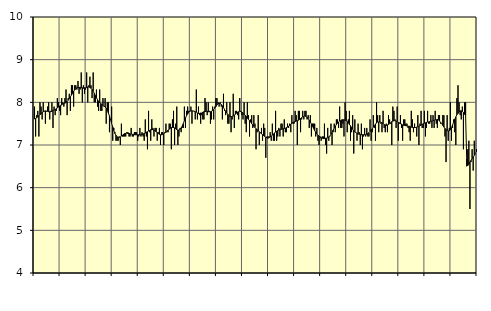
| Category | Transport, SNI 49-53 | Series 1 |
|---|---|---|
| nan | 7.9 | 7.61 |
| 87.0 | 7.2 | 7.62 |
| 87.0 | 7.7 | 7.64 |
| 87.0 | 7.8 | 7.66 |
| 87.0 | 7.2 | 7.69 |
| 87.0 | 8 | 7.71 |
| 87.0 | 7.9 | 7.73 |
| 87.0 | 7.6 | 7.76 |
| 87.0 | 8 | 7.78 |
| 87.0 | 7.8 | 7.79 |
| 87.0 | 7.5 | 7.8 |
| 87.0 | 7.8 | 7.79 |
| nan | 7.9 | 7.79 |
| 88.0 | 8 | 7.78 |
| 88.0 | 7.6 | 7.78 |
| 88.0 | 7.8 | 7.78 |
| 88.0 | 8 | 7.79 |
| 88.0 | 7.4 | 7.81 |
| 88.0 | 7.9 | 7.82 |
| 88.0 | 7.7 | 7.83 |
| 88.0 | 7.8 | 7.85 |
| 88.0 | 8.1 | 7.87 |
| 88.0 | 8 | 7.89 |
| 88.0 | 7.8 | 7.91 |
| nan | 7.7 | 7.93 |
| 89.0 | 8.1 | 7.94 |
| 89.0 | 8 | 7.96 |
| 89.0 | 7.9 | 7.97 |
| 89.0 | 8.1 | 7.98 |
| 89.0 | 8.3 | 8 |
| 89.0 | 7.7 | 8.02 |
| 89.0 | 8.1 | 8.05 |
| 89.0 | 8.2 | 8.09 |
| 89.0 | 7.8 | 8.13 |
| 89.0 | 8.4 | 8.17 |
| 89.0 | 8.4 | 8.21 |
| nan | 7.9 | 8.26 |
| 90.0 | 8.4 | 8.29 |
| 90.0 | 8.4 | 8.32 |
| 90.0 | 8.3 | 8.34 |
| 90.0 | 8.5 | 8.35 |
| 90.0 | 8.2 | 8.35 |
| 90.0 | 8.3 | 8.35 |
| 90.0 | 8.7 | 8.34 |
| 90.0 | 8 | 8.34 |
| 90.0 | 8.4 | 8.33 |
| 90.0 | 8.2 | 8.34 |
| 90.0 | 8.3 | 8.34 |
| nan | 8.7 | 8.35 |
| 91.0 | 8 | 8.36 |
| 91.0 | 8.4 | 8.36 |
| 91.0 | 8.6 | 8.35 |
| 91.0 | 8.4 | 8.33 |
| 91.0 | 8.1 | 8.3 |
| 91.0 | 8.7 | 8.26 |
| 91.0 | 8 | 8.21 |
| 91.0 | 8 | 8.16 |
| 91.0 | 8.3 | 8.11 |
| 91.0 | 7.9 | 8.06 |
| 91.0 | 7.8 | 8.02 |
| nan | 8.3 | 7.99 |
| 92.0 | 7.8 | 7.97 |
| 92.0 | 7.8 | 7.95 |
| 92.0 | 8.1 | 7.93 |
| 92.0 | 7.9 | 7.91 |
| 92.0 | 8.1 | 7.89 |
| 92.0 | 7.5 | 7.86 |
| 92.0 | 8 | 7.81 |
| 92.0 | 8 | 7.75 |
| 92.0 | 7.3 | 7.68 |
| 92.0 | 7.6 | 7.59 |
| 92.0 | 7.9 | 7.51 |
| nan | 7.1 | 7.42 |
| 93.0 | 7.4 | 7.34 |
| 93.0 | 7.3 | 7.27 |
| 93.0 | 7.1 | 7.23 |
| 93.0 | 7.1 | 7.19 |
| 93.0 | 7.1 | 7.18 |
| 93.0 | 7.2 | 7.18 |
| 93.0 | 7 | 7.19 |
| 93.0 | 7.5 | 7.21 |
| 93.0 | 7.2 | 7.23 |
| 93.0 | 7.2 | 7.25 |
| 93.0 | 7.2 | 7.27 |
| nan | 7.2 | 7.27 |
| 94.0 | 7.3 | 7.28 |
| 94.0 | 7.3 | 7.27 |
| 94.0 | 7.2 | 7.27 |
| 94.0 | 7.2 | 7.26 |
| 94.0 | 7.4 | 7.26 |
| 94.0 | 7.2 | 7.25 |
| 94.0 | 7.2 | 7.25 |
| 94.0 | 7.3 | 7.24 |
| 94.0 | 7.3 | 7.24 |
| 94.0 | 7.3 | 7.24 |
| 94.0 | 7.1 | 7.24 |
| nan | 7.2 | 7.24 |
| 95.0 | 7.4 | 7.24 |
| 95.0 | 7.2 | 7.24 |
| 95.0 | 7.3 | 7.25 |
| 95.0 | 7.2 | 7.26 |
| 95.0 | 7.1 | 7.27 |
| 95.0 | 7.6 | 7.28 |
| 95.0 | 7.2 | 7.3 |
| 95.0 | 6.9 | 7.31 |
| 95.0 | 7.8 | 7.33 |
| 95.0 | 7.3 | 7.34 |
| 95.0 | 7.1 | 7.36 |
| nan | 7.6 | 7.36 |
| 96.0 | 7.4 | 7.36 |
| 96.0 | 7.2 | 7.35 |
| 96.0 | 7.4 | 7.33 |
| 96.0 | 7.4 | 7.31 |
| 96.0 | 7.1 | 7.29 |
| 96.0 | 7.3 | 7.27 |
| 96.0 | 7.4 | 7.25 |
| 96.0 | 7 | 7.24 |
| 96.0 | 7.3 | 7.24 |
| 96.0 | 7.3 | 7.25 |
| 96.0 | 7 | 7.26 |
| nan | 7.3 | 7.28 |
| 97.0 | 7.5 | 7.3 |
| 97.0 | 7.3 | 7.32 |
| 97.0 | 7.3 | 7.35 |
| 97.0 | 7.5 | 7.37 |
| 97.0 | 7.5 | 7.39 |
| 97.0 | 6.9 | 7.41 |
| 97.0 | 7.6 | 7.41 |
| 97.0 | 7.8 | 7.41 |
| 97.0 | 7 | 7.4 |
| 97.0 | 7.5 | 7.38 |
| 97.0 | 7.9 | 7.36 |
| nan | 7 | 7.35 |
| 98.0 | 7.2 | 7.35 |
| 98.0 | 7.4 | 7.37 |
| 98.0 | 7.3 | 7.4 |
| 98.0 | 7.4 | 7.44 |
| 98.0 | 7.4 | 7.5 |
| 98.0 | 7.9 | 7.57 |
| 98.0 | 7.4 | 7.63 |
| 98.0 | 7.8 | 7.69 |
| 98.0 | 7.9 | 7.73 |
| 98.0 | 7.8 | 7.77 |
| 98.0 | 7.8 | 7.79 |
| nan | 7.9 | 7.8 |
| 99.0 | 7.5 | 7.8 |
| 99.0 | 7.8 | 7.8 |
| 99.0 | 7.8 | 7.79 |
| 99.0 | 7.6 | 7.78 |
| 99.0 | 8.3 | 7.77 |
| 99.0 | 7.6 | 7.75 |
| 99.0 | 7.9 | 7.74 |
| 99.0 | 7.7 | 7.74 |
| 99.0 | 7.5 | 7.75 |
| 99.0 | 7.7 | 7.75 |
| 99.0 | 7.6 | 7.77 |
| nan | 7.6 | 7.78 |
| 0.0 | 8.1 | 7.78 |
| 0.0 | 8 | 7.79 |
| 0.0 | 7.7 | 7.79 |
| 0.0 | 8 | 7.78 |
| 0.0 | 7.8 | 7.78 |
| 0.0 | 7.5 | 7.78 |
| 0.0 | 7.6 | 7.79 |
| 0.0 | 7.9 | 7.81 |
| 0.0 | 7.6 | 7.83 |
| 0.0 | 7.9 | 7.87 |
| 0.0 | 8.1 | 7.9 |
| nan | 8.1 | 7.94 |
| 1.0 | 8 | 7.97 |
| 1.0 | 7.9 | 7.98 |
| 1.0 | 8 | 7.97 |
| 1.0 | 7.9 | 7.95 |
| 1.0 | 7.6 | 7.92 |
| 1.0 | 8.2 | 7.88 |
| 1.0 | 7.8 | 7.83 |
| 1.0 | 7.7 | 7.79 |
| 1.0 | 8 | 7.75 |
| 1.0 | 7.5 | 7.72 |
| 1.0 | 7.5 | 7.69 |
| nan | 8 | 7.67 |
| 2.0 | 7.3 | 7.66 |
| 2.0 | 7.6 | 7.67 |
| 2.0 | 8.2 | 7.68 |
| 2.0 | 7.4 | 7.7 |
| 2.0 | 7.8 | 7.72 |
| 2.0 | 7.8 | 7.75 |
| 2.0 | 7.7 | 7.77 |
| 2.0 | 7.6 | 7.78 |
| 2.0 | 8.1 | 7.79 |
| 2.0 | 7.8 | 7.78 |
| 2.0 | 7.7 | 7.77 |
| nan | 7.6 | 7.75 |
| 3.0 | 8 | 7.72 |
| 3.0 | 7.5 | 7.7 |
| 3.0 | 7.3 | 7.67 |
| 3.0 | 8 | 7.63 |
| 3.0 | 7.7 | 7.6 |
| 3.0 | 7.2 | 7.57 |
| 3.0 | 7.6 | 7.54 |
| 3.0 | 7.7 | 7.5 |
| 3.0 | 7.4 | 7.47 |
| 3.0 | 7.7 | 7.44 |
| 3.0 | 7.5 | 7.41 |
| nan | 6.9 | 7.38 |
| 4.0 | 7.3 | 7.36 |
| 4.0 | 7.7 | 7.33 |
| 4.0 | 7 | 7.31 |
| 4.0 | 7.3 | 7.29 |
| 4.0 | 7.4 | 7.26 |
| 4.0 | 7.1 | 7.24 |
| 4.0 | 7.5 | 7.22 |
| 4.0 | 7.4 | 7.2 |
| 4.0 | 6.7 | 7.18 |
| 4.0 | 7.2 | 7.17 |
| 4.0 | 7.2 | 7.16 |
| nan | 7.2 | 7.17 |
| 5.0 | 7.3 | 7.19 |
| 5.0 | 7.1 | 7.21 |
| 5.0 | 7.5 | 7.23 |
| 5.0 | 7.1 | 7.26 |
| 5.0 | 7.1 | 7.28 |
| 5.0 | 7.8 | 7.31 |
| 5.0 | 7.1 | 7.32 |
| 5.0 | 7.2 | 7.34 |
| 5.0 | 7.4 | 7.35 |
| 5.0 | 7.2 | 7.36 |
| 5.0 | 7.5 | 7.37 |
| nan | 7.5 | 7.37 |
| 6.0 | 7.2 | 7.38 |
| 6.0 | 7.6 | 7.39 |
| 6.0 | 7.3 | 7.39 |
| 6.0 | 7.3 | 7.41 |
| 6.0 | 7.5 | 7.42 |
| 6.0 | 7.4 | 7.44 |
| 6.0 | 7.5 | 7.46 |
| 6.0 | 7.3 | 7.49 |
| 6.0 | 7.7 | 7.51 |
| 6.0 | 7.5 | 7.53 |
| 6.0 | 7.5 | 7.54 |
| nan | 7.8 | 7.55 |
| 7.0 | 7.7 | 7.56 |
| 7.0 | 7 | 7.57 |
| 7.0 | 7.8 | 7.58 |
| 7.0 | 7.8 | 7.6 |
| 7.0 | 7.3 | 7.62 |
| 7.0 | 7.6 | 7.64 |
| 7.0 | 7.8 | 7.66 |
| 7.0 | 7.6 | 7.67 |
| 7.0 | 7.8 | 7.68 |
| 7.0 | 7.8 | 7.67 |
| 7.0 | 7.6 | 7.65 |
| nan | 7.7 | 7.62 |
| 8.0 | 7.4 | 7.58 |
| 8.0 | 7.7 | 7.54 |
| 8.0 | 7.2 | 7.49 |
| 8.0 | 7.5 | 7.44 |
| 8.0 | 7.5 | 7.39 |
| 8.0 | 7.5 | 7.34 |
| 8.0 | 7.2 | 7.3 |
| 8.0 | 7.4 | 7.26 |
| 8.0 | 7.1 | 7.23 |
| 8.0 | 7 | 7.21 |
| 8.0 | 7.2 | 7.18 |
| nan | 7.1 | 7.17 |
| 9.0 | 7.2 | 7.16 |
| 9.0 | 7.2 | 7.15 |
| 9.0 | 7.5 | 7.15 |
| 9.0 | 7 | 7.16 |
| 9.0 | 6.8 | 7.16 |
| 9.0 | 7.4 | 7.17 |
| 9.0 | 7.1 | 7.19 |
| 9.0 | 7.2 | 7.21 |
| 9.0 | 7.5 | 7.25 |
| 9.0 | 7 | 7.29 |
| 9.0 | 7.3 | 7.35 |
| nan | 7.5 | 7.4 |
| 10.0 | 7.3 | 7.44 |
| 10.0 | 7.6 | 7.48 |
| 10.0 | 7.6 | 7.51 |
| 10.0 | 7.4 | 7.54 |
| 10.0 | 7.9 | 7.56 |
| 10.0 | 7.4 | 7.57 |
| 10.0 | 7.4 | 7.59 |
| 10.0 | 7.5 | 7.59 |
| 10.0 | 7.2 | 7.59 |
| 10.0 | 8 | 7.58 |
| 10.0 | 7.8 | 7.57 |
| nan | 7.3 | 7.55 |
| 11.0 | 7.6 | 7.52 |
| 11.0 | 7.8 | 7.48 |
| 11.0 | 7.1 | 7.45 |
| 11.0 | 7.3 | 7.41 |
| 11.0 | 7.7 | 7.37 |
| 11.0 | 6.8 | 7.33 |
| 11.0 | 7.6 | 7.31 |
| 11.0 | 7.3 | 7.29 |
| 11.0 | 7.1 | 7.27 |
| 11.0 | 7.5 | 7.26 |
| 11.0 | 7.3 | 7.25 |
| nan | 7 | 7.25 |
| 12.0 | 7.5 | 7.24 |
| 12.0 | 6.9 | 7.24 |
| 12.0 | 7.2 | 7.24 |
| 12.0 | 7.4 | 7.24 |
| 12.0 | 7.2 | 7.24 |
| 12.0 | 7.4 | 7.25 |
| 12.0 | 7.2 | 7.27 |
| 12.0 | 7.2 | 7.29 |
| 12.0 | 7.6 | 7.32 |
| 12.0 | 7.1 | 7.35 |
| 12.0 | 7.3 | 7.38 |
| nan | 7.7 | 7.42 |
| 13.0 | 7.4 | 7.45 |
| 13.0 | 7.1 | 7.49 |
| 13.0 | 8 | 7.52 |
| 13.0 | 7.7 | 7.54 |
| 13.0 | 7.3 | 7.54 |
| 13.0 | 7.7 | 7.54 |
| 13.0 | 7.5 | 7.53 |
| 13.0 | 7.3 | 7.52 |
| 13.0 | 7.8 | 7.5 |
| 13.0 | 7.4 | 7.48 |
| 13.0 | 7.3 | 7.47 |
| nan | 7.5 | 7.46 |
| 14.0 | 7.3 | 7.47 |
| 14.0 | 7.7 | 7.48 |
| 14.0 | 7.6 | 7.5 |
| 14.0 | 7.5 | 7.52 |
| 14.0 | 7 | 7.55 |
| 14.0 | 7.9 | 7.56 |
| 14.0 | 7.8 | 7.57 |
| 14.0 | 7.6 | 7.57 |
| 14.0 | 7.4 | 7.56 |
| 14.0 | 7.9 | 7.55 |
| 14.0 | 7.1 | 7.53 |
| nan | 7.5 | 7.52 |
| 15.0 | 7.7 | 7.5 |
| 15.0 | 7.4 | 7.49 |
| 15.0 | 7.1 | 7.47 |
| 15.0 | 7.6 | 7.46 |
| 15.0 | 7.6 | 7.46 |
| 15.0 | 7.5 | 7.45 |
| 15.0 | 7.5 | 7.45 |
| 15.0 | 7.4 | 7.44 |
| 15.0 | 7.3 | 7.44 |
| 15.0 | 7.1 | 7.43 |
| 15.0 | 7.8 | 7.42 |
| nan | 7.6 | 7.41 |
| 16.0 | 7.3 | 7.41 |
| 16.0 | 7.5 | 7.41 |
| 16.0 | 7.4 | 7.41 |
| 16.0 | 7.2 | 7.42 |
| 16.0 | 7.7 | 7.43 |
| 16.0 | 7 | 7.44 |
| 16.0 | 7.5 | 7.45 |
| 16.0 | 7.8 | 7.47 |
| 16.0 | 7.4 | 7.48 |
| 16.0 | 7.4 | 7.5 |
| 16.0 | 7.8 | 7.51 |
| nan | 7.2 | 7.52 |
| 17.0 | 7.4 | 7.53 |
| 17.0 | 7.8 | 7.54 |
| 17.0 | 7.5 | 7.54 |
| 17.0 | 7.5 | 7.55 |
| 17.0 | 7.7 | 7.56 |
| 17.0 | 7.4 | 7.56 |
| 17.0 | 7.7 | 7.57 |
| 17.0 | 7.4 | 7.58 |
| 17.0 | 7.8 | 7.59 |
| 17.0 | 7.5 | 7.59 |
| 17.0 | 7.4 | 7.6 |
| nan | 7.7 | 7.59 |
| 18.0 | 7.7 | 7.56 |
| 18.0 | 7.5 | 7.53 |
| 18.0 | 7.5 | 7.5 |
| 18.0 | 7.7 | 7.46 |
| 18.0 | 7.7 | 7.42 |
| 18.0 | 7.2 | 7.39 |
| 18.0 | 6.6 | 7.36 |
| 18.0 | 7.7 | 7.34 |
| 18.0 | 7.1 | 7.33 |
| 18.0 | 7.4 | 7.33 |
| 18.0 | 8 | 7.36 |
| nan | 7.1 | 7.4 |
| 19.0 | 7.4 | 7.47 |
| 19.0 | 7.6 | 7.53 |
| 19.0 | 7.3 | 7.6 |
| 19.0 | 7 | 7.66 |
| 19.0 | 8.1 | 7.71 |
| 19.0 | 8.4 | 7.74 |
| 19.0 | 8 | 7.78 |
| 19.0 | 7.7 | 7.8 |
| 19.0 | 7.6 | 7.8 |
| 19.0 | 7.9 | 7.79 |
| 19.0 | 6.9 | 7.76 |
| nan | 8 | 7.72 |
| 20.0 | 8 | 7.69 |
| 20.0 | 6.5 | 6.68 |
| 20.0 | 6.9 | 6.52 |
| 20.0 | 7.1 | 6.56 |
| 20.0 | 5.5 | 6.6 |
| 20.0 | 6.6 | 6.64 |
| 20.0 | 6.9 | 6.68 |
| 20.0 | 6.4 | 6.71 |
| 20.0 | 7.1 | 6.76 |
| 20.0 | 6.8 | 6.8 |
| 20.0 | 6.9 | 6.84 |